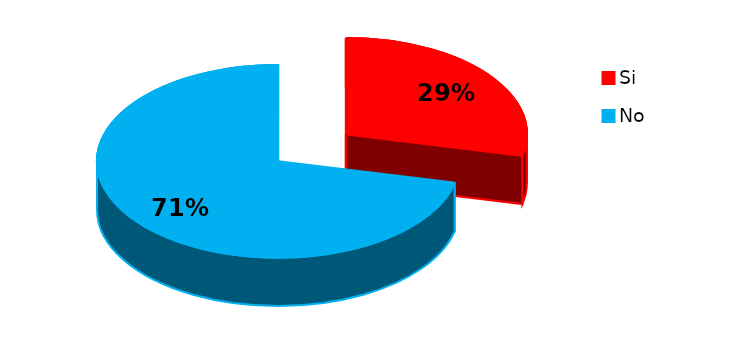
| Category | Series 0 |
|---|---|
| 0 | 6 |
| 1 | 15 |